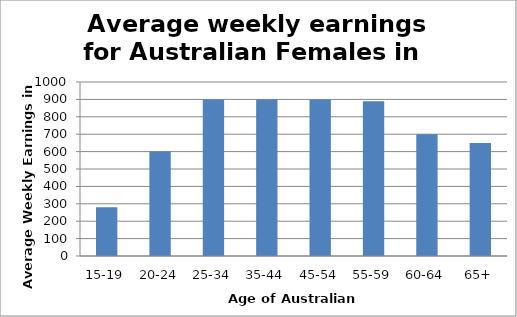
| Category | Average weekly earnings |
|---|---|
| 15-19 | 280 |
| 20-24 | 600 |
| 25-34 | 900 |
| 35-44 | 900 |
| 45-54 | 900 |
| 55-59 | 890 |
| 60-64 | 700 |
| 65+ | 650 |